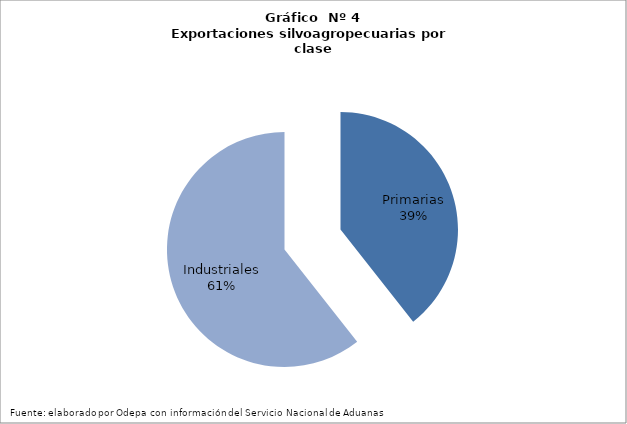
| Category | Series 0 |
|---|---|
| Primarias | 4376833 |
| Industriales | 6735320 |